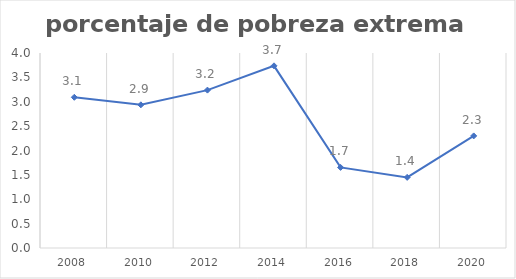
| Category | Series 0 |
|---|---|
| 2008.0 | 3.092 |
| 2010.0 | 2.937 |
| 2012.0 | 3.239 |
| 2014.0 | 3.737 |
| 2016.0 | 1.653 |
| 2018.0 | 1.449 |
| 2020.0 | 2.299 |